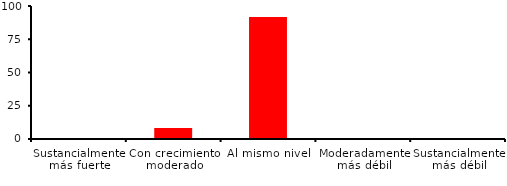
| Category | Series 0 |
|---|---|
| Sustancialmente más fuerte | 0 |
| Con crecimiento moderado | 8.333 |
| Al mismo nivel | 91.667 |
| Moderadamente más débil | 0 |
| Sustancialmente más débil | 0 |